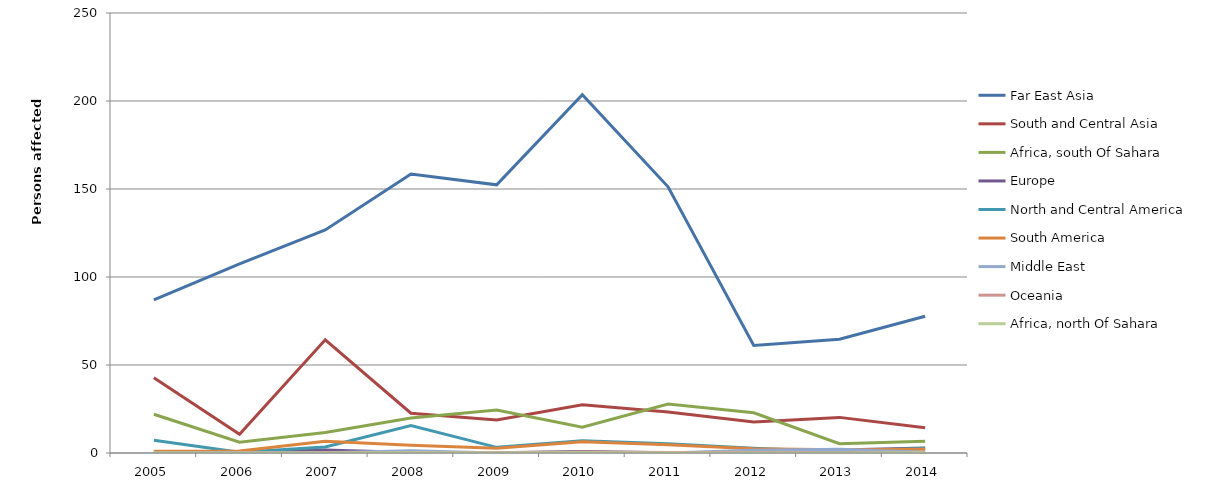
| Category | Far East Asia | South and Central Asia | Africa, south Of Sahara | Europe | North and Central America | South America | Middle East | Oceania | Africa, north Of Sahara |
|---|---|---|---|---|---|---|---|---|---|
| 2005.0 | 86.95 | 42.769 | 22.033 | 0.533 | 7.195 | 1.055 | 0.131 | 0.028 | 0.002 |
| 2006.0 | 107.478 | 10.591 | 6.093 | 0.259 | 0.431 | 1.118 | 0.234 | 0.038 | 0.062 |
| 2007.0 | 126.719 | 64.281 | 11.602 | 1.65 | 3.471 | 6.707 | 0.187 | 0.172 | 0.008 |
| 2008.0 | 158.552 | 22.597 | 19.905 | 0.257 | 15.565 | 4.389 | 1.349 | 0.105 | 0.08 |
| 2009.0 | 152.353 | 18.805 | 24.409 | 0.141 | 3.213 | 2.755 | 0.013 | 0.077 | 0.012 |
| 2010.0 | 203.61 | 27.447 | 14.658 | 0.819 | 6.89 | 6.37 | 0.026 | 0.548 | 0.081 |
| 2011.0 | 151.255 | 23.315 | 27.831 | 0.079 | 5.268 | 4.676 | 0.002 | 0.341 | 0.001 |
| 2012.0 | 61.088 | 17.606 | 22.888 | 0.577 | 2.668 | 2.384 | 1.507 | 0.263 | 0.008 |
| 2013.0 | 64.617 | 20.238 | 5.24 | 1.749 | 0.686 | 1.914 | 2.122 | 0.08 | 0.002 |
| 2014.0 | 77.695 | 14.373 | 6.72 | 2.865 | 2.752 | 2.198 | 0.453 | 0.17 | 0.117 |